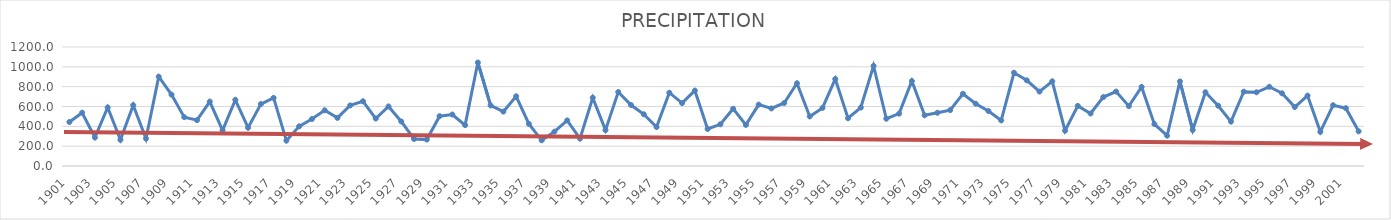
| Category | PRECIPITATION |
|---|---|
| 1901.0 | 443.521 |
| 1902.0 | 537.28 |
| 1903.0 | 287.488 |
| 1904.0 | 590.576 |
| 1905.0 | 264.382 |
| 1906.0 | 613.296 |
| 1907.0 | 276.614 |
| 1908.0 | 900.27 |
| 1909.0 | 720.023 |
| 1910.0 | 492.475 |
| 1911.0 | 462.406 |
| 1912.0 | 649.645 |
| 1913.0 | 359.19 |
| 1914.0 | 666.308 |
| 1915.0 | 385.784 |
| 1916.0 | 624.592 |
| 1917.0 | 687.436 |
| 1918.0 | 255.612 |
| 1919.0 | 399.771 |
| 1920.0 | 473.536 |
| 1921.0 | 561.749 |
| 1922.0 | 485.089 |
| 1923.0 | 610.733 |
| 1924.0 | 652.915 |
| 1925.0 | 478.569 |
| 1926.0 | 600.586 |
| 1927.0 | 449.006 |
| 1928.0 | 272.737 |
| 1929.0 | 266.333 |
| 1930.0 | 502.5 |
| 1931.0 | 519.091 |
| 1932.0 | 412.075 |
| 1933.0 | 1043.242 |
| 1934.0 | 610.544 |
| 1935.0 | 548.595 |
| 1936.0 | 702.919 |
| 1937.0 | 424.309 |
| 1938.0 | 258.851 |
| 1939.0 | 346.299 |
| 1940.0 | 459.624 |
| 1941.0 | 276.313 |
| 1942.0 | 688.904 |
| 1943.0 | 361.639 |
| 1944.0 | 746.084 |
| 1945.0 | 614.819 |
| 1946.0 | 521.425 |
| 1947.0 | 392.868 |
| 1948.0 | 739.255 |
| 1949.0 | 634.422 |
| 1950.0 | 760.243 |
| 1951.0 | 373.021 |
| 1952.0 | 420.484 |
| 1953.0 | 577.223 |
| 1954.0 | 414.389 |
| 1955.0 | 619.234 |
| 1956.0 | 580.494 |
| 1957.0 | 635.405 |
| 1958.0 | 834.002 |
| 1959.0 | 499.725 |
| 1960.0 | 585.815 |
| 1961.0 | 877.298 |
| 1962.0 | 481.903 |
| 1963.0 | 589.443 |
| 1964.0 | 1009.768 |
| 1965.0 | 476.501 |
| 1966.0 | 527.717 |
| 1967.0 | 856.474 |
| 1968.0 | 511.614 |
| 1969.0 | 536.884 |
| 1970.0 | 563.444 |
| 1971.0 | 728.216 |
| 1972.0 | 628.163 |
| 1973.0 | 554.354 |
| 1974.0 | 459.716 |
| 1975.0 | 940.464 |
| 1976.0 | 863.917 |
| 1977.0 | 750.452 |
| 1978.0 | 853.961 |
| 1979.0 | 355.913 |
| 1980.0 | 606.06 |
| 1981.0 | 529.3 |
| 1982.0 | 695.075 |
| 1983.0 | 750.609 |
| 1984.0 | 603.615 |
| 1985.0 | 797.233 |
| 1986.0 | 422.085 |
| 1987.0 | 305.948 |
| 1988.0 | 852.942 |
| 1989.0 | 363.069 |
| 1990.0 | 743.63 |
| 1991.0 | 608.114 |
| 1992.0 | 447.192 |
| 1993.0 | 749.364 |
| 1994.0 | 743.202 |
| 1995.0 | 798.782 |
| 1996.0 | 733.39 |
| 1997.0 | 594.427 |
| 1998.0 | 709.784 |
| 1999.0 | 344.241 |
| 2000.0 | 613.22 |
| 2001.0 | 583.204 |
| 2002.0 | 349.549 |